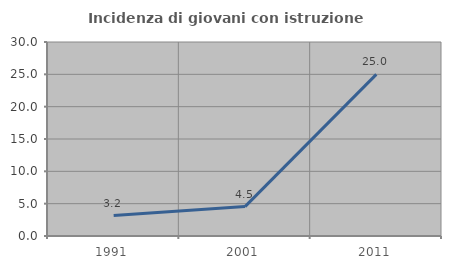
| Category | Incidenza di giovani con istruzione universitaria |
|---|---|
| 1991.0 | 3.158 |
| 2001.0 | 4.545 |
| 2011.0 | 25 |